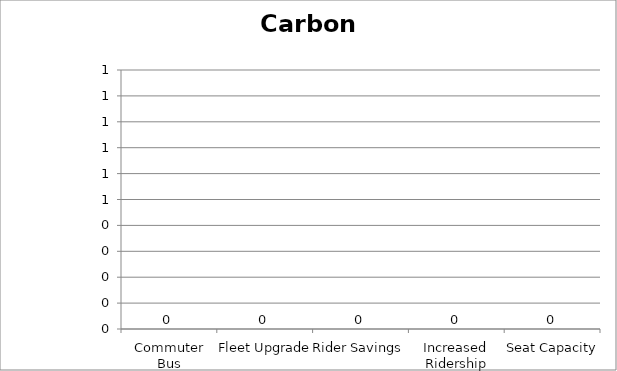
| Category | Carbon Monoxide |
|---|---|
| Commuter Bus | 0 |
| Fleet Upgrade | 0 |
| Rider Savings | 0 |
| Increased Ridership | 0 |
| Seat Capacity | 0 |